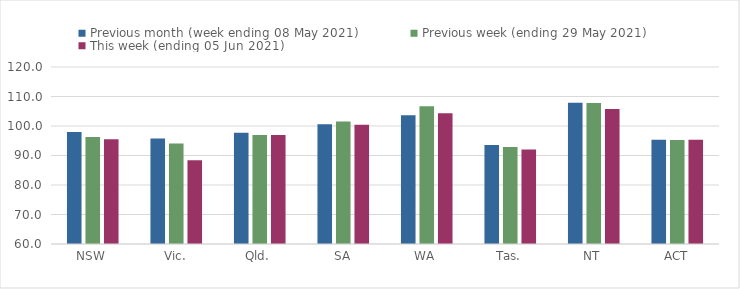
| Category | Previous month (week ending 08 May 2021) | Previous week (ending 29 May 2021) | This week (ending 05 Jun 2021) |
|---|---|---|---|
| NSW | 97.95 | 96.29 | 95.52 |
| Vic. | 95.77 | 94.07 | 88.36 |
| Qld. | 97.7 | 96.91 | 96.98 |
| SA | 100.61 | 101.52 | 100.45 |
| WA | 103.62 | 106.73 | 104.35 |
| Tas. | 93.6 | 92.85 | 92.06 |
| NT | 107.86 | 107.76 | 105.8 |
| ACT | 95.32 | 95.26 | 95.38 |